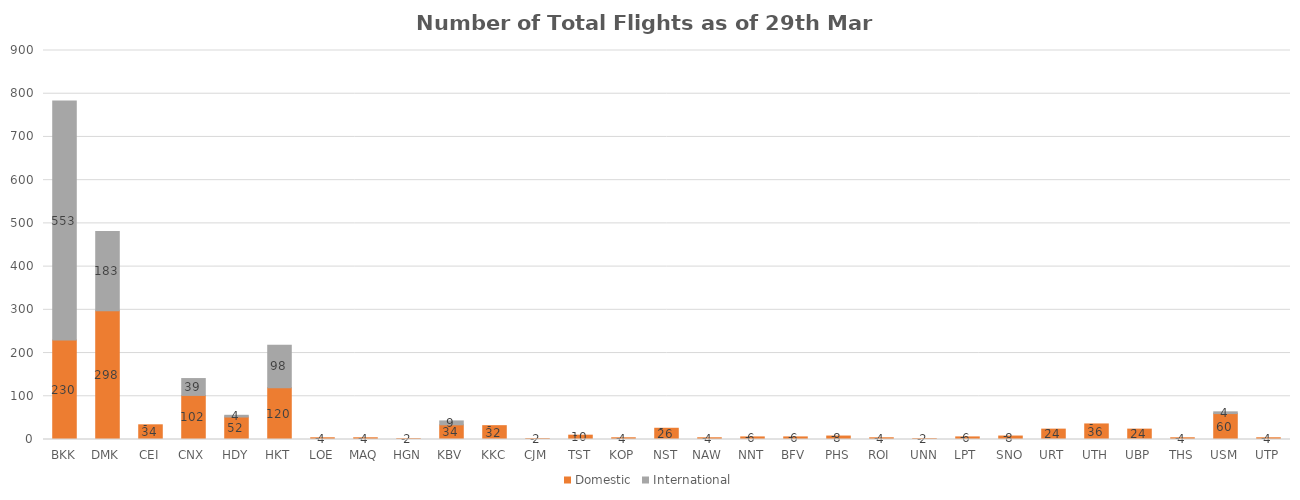
| Category | Domestic | International |
|---|---|---|
| BKK | 230 | 553 |
| DMK | 298 | 183 |
| CEI | 34 | 0 |
| CNX | 102 | 39 |
| HDY | 52 | 4 |
| HKT | 120 | 98 |
| LOE | 4 | 0 |
| MAQ | 4 | 0 |
| HGN | 2 | 0 |
| KBV | 34 | 9 |
| KKC | 32 | 0 |
| CJM | 2 | 0 |
| TST | 10 | 0 |
| KOP | 4 | 0 |
| NST | 26 | 0 |
| NAW | 4 | 0 |
| NNT | 6 | 0 |
| BFV | 6 | 0 |
| PHS | 8 | 0 |
| ROI | 4 | 0 |
| UNN | 2 | 0 |
| LPT | 6 | 0 |
| SNO | 8 | 0 |
| URT | 24 | 0 |
| UTH | 36 | 0 |
| UBP | 24 | 0 |
| THS | 4 | 0 |
| USM | 60 | 4 |
| UTP | 4 | 0 |